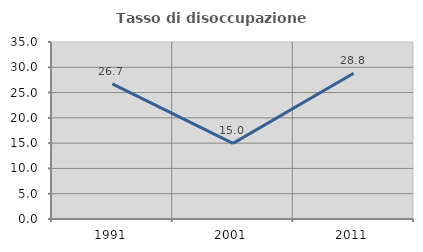
| Category | Tasso di disoccupazione giovanile  |
|---|---|
| 1991.0 | 26.738 |
| 2001.0 | 14.953 |
| 2011.0 | 28.814 |